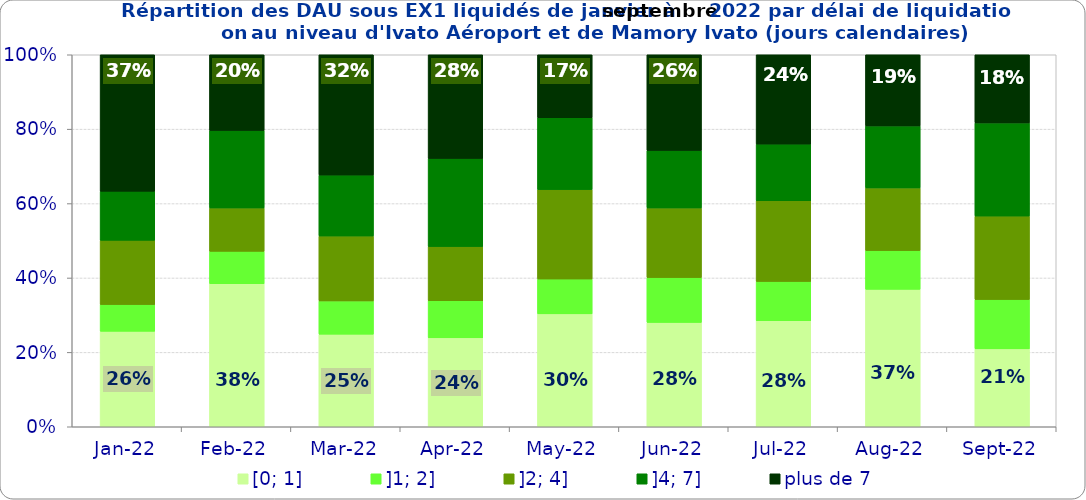
| Category | [0; 1] | ]1; 2] | ]2; 4] | ]4; 7] | plus de 7 |
|---|---|---|---|---|---|
| 2022-01-01 | 0.257 | 0.072 | 0.173 | 0.132 | 0.367 |
| 2022-02-01 | 0.385 | 0.087 | 0.117 | 0.208 | 0.203 |
| 2022-03-01 | 0.249 | 0.089 | 0.174 | 0.164 | 0.323 |
| 2022-04-01 | 0.239 | 0.1 | 0.146 | 0.237 | 0.279 |
| 2022-05-01 | 0.303 | 0.094 | 0.24 | 0.193 | 0.169 |
| 2022-06-01 | 0.281 | 0.121 | 0.187 | 0.155 | 0.257 |
| 2022-07-01 | 0.285 | 0.106 | 0.217 | 0.152 | 0.24 |
| 2022-08-01 | 0.369 | 0.104 | 0.169 | 0.167 | 0.191 |
| 2022-09-01 | 0.209 | 0.133 | 0.224 | 0.25 | 0.183 |